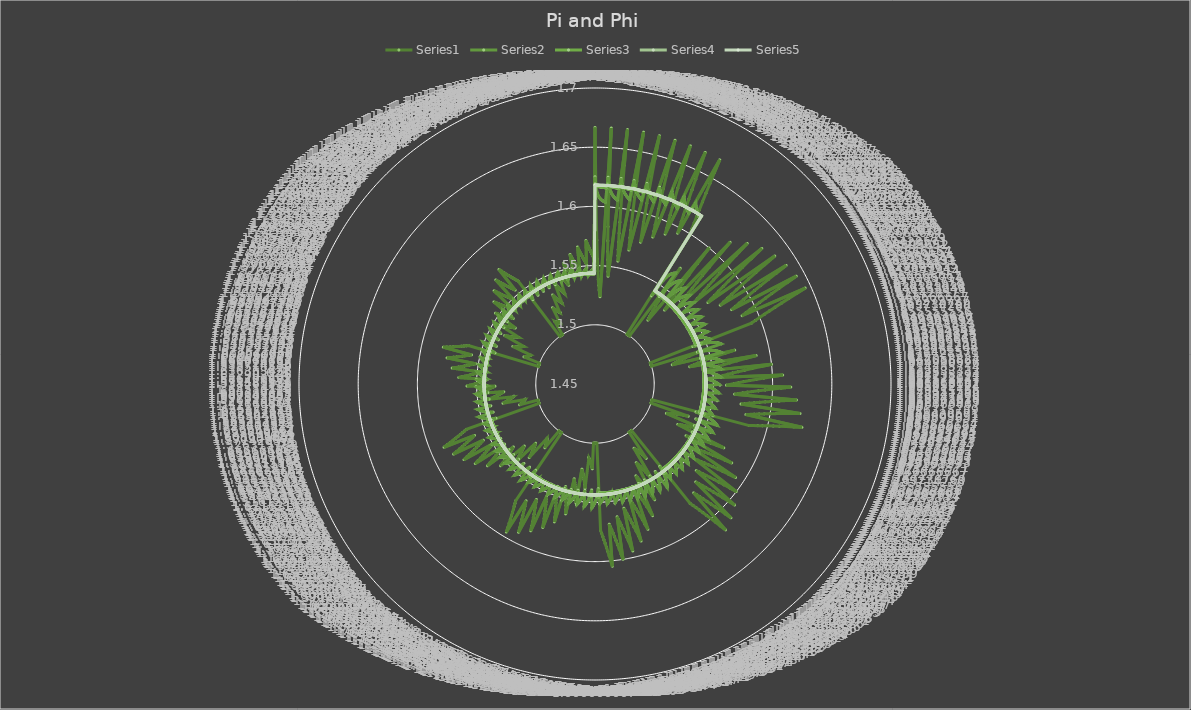
| Category | Series 0 | Series 1 | Series 2 | Series 3 | Series 4 |
|---|---|---|---|---|---|
| 1.5 | 1.667 | 1.625 | 1.619 | 1.618 | 1.618 |
| 1.6666666666666667 | 1.6 | 1.615 | 1.618 | 1.618 | 1.618 |
| 1.75 | 1.571 | 1.611 | 1.617 | 1.618 | 1.618 |
| 1.8 | 1.556 | 1.609 | 1.617 | 1.618 | 1.618 |
| 1.8333333333333333 | 1.545 | 1.607 | 1.616 | 1.618 | 1.618 |
| 1.8571428571428572 | 1.538 | 1.606 | 1.616 | 1.618 | 1.618 |
| 1.875 | 1.533 | 1.605 | 1.616 | 1.618 | 1.618 |
| 1.8888888888888888 | 1.529 | 1.605 | 1.616 | 1.618 | 1.618 |
| 1.9 | 1.526 | 1.604 | 1.616 | 1.618 | 1.618 |
| 1.9090909090909092 | 1.524 | 1.604 | 1.616 | 1.618 | 1.618 |
| 1.5 | 1.667 | 1.625 | 1.619 | 1.618 | 1.618 |
| 1.6 | 1.625 | 1.619 | 1.618 | 1.618 | 1.618 |
| 1.6666666666666667 | 1.6 | 1.615 | 1.618 | 1.618 | 1.618 |
| 1.7142857142857142 | 1.583 | 1.613 | 1.617 | 1.618 | 1.618 |
| 1.75 | 1.571 | 1.611 | 1.617 | 1.618 | 1.618 |
| 1.7777777777777777 | 1.562 | 1.61 | 1.617 | 1.618 | 1.618 |
| 1.8 | 1.556 | 1.609 | 1.617 | 1.618 | 1.618 |
| 1.8181818181818181 | 1.55 | 1.608 | 1.617 | 1.618 | 1.618 |
| 1.8333333333333333 | 1.545 | 1.607 | 1.616 | 1.618 | 1.618 |
| 1.8461538461538463 | 1.542 | 1.607 | 1.616 | 1.618 | 1.618 |
| 1.5 | 1.667 | 1.625 | 1.619 | 1.618 | 1.618 |
| 1.5714285714285714 | 1.636 | 1.621 | 1.618 | 1.618 | 1.618 |
| 1.625 | 1.615 | 1.618 | 1.618 | 1.618 | 1.618 |
| 1.6666666666666667 | 1.6 | 1.615 | 1.618 | 1.618 | 1.618 |
| 1.7 | 1.588 | 1.614 | 1.617 | 1.618 | 1.618 |
| 1.7272727272727273 | 1.579 | 1.612 | 1.617 | 1.618 | 1.618 |
| 1.75 | 1.571 | 1.611 | 1.617 | 1.618 | 1.618 |
| 1.7692307692307692 | 1.565 | 1.61 | 1.617 | 1.618 | 1.618 |
| 1.7857142857142858 | 1.56 | 1.609 | 1.617 | 1.618 | 1.618 |
| 1.8 | 1.556 | 1.609 | 1.617 | 1.618 | 1.618 |
| 1.5 | 1.667 | 1.625 | 1.619 | 1.618 | 1.618 |
| 1.5555555555555556 | 1.643 | 1.622 | 1.619 | 1.618 | 1.618 |
| 1.6 | 1.625 | 1.619 | 1.618 | 1.618 | 1.618 |
| 1.6363636363636365 | 1.611 | 1.617 | 1.618 | 1.618 | 1.618 |
| 1.6666666666666667 | 1.6 | 1.615 | 1.618 | 1.618 | 1.618 |
| 1.6923076923076923 | 1.591 | 1.614 | 1.617 | 1.618 | 1.618 |
| 1.7142857142857142 | 1.583 | 1.613 | 1.617 | 1.618 | 1.618 |
| 1.7333333333333334 | 1.577 | 1.612 | 1.617 | 1.618 | 1.618 |
| 1.75 | 1.571 | 1.611 | 1.617 | 1.618 | 1.618 |
| 1.7647058823529411 | 1.567 | 1.61 | 1.617 | 1.618 | 1.618 |
| 1.5 | 1.667 | 1.625 | 1.619 | 1.618 | 1.618 |
| 1.5454545454545454 | 1.647 | 1.622 | 1.619 | 1.618 | 1.618 |
| 1.5833333333333333 | 1.632 | 1.62 | 1.618 | 1.618 | 1.618 |
| 1.6153846153846154 | 1.619 | 1.618 | 1.618 | 1.618 | 1.618 |
| 1.6428571428571428 | 1.609 | 1.617 | 1.618 | 1.618 | 1.618 |
| 1.6666666666666667 | 1.6 | 1.615 | 1.618 | 1.618 | 1.618 |
| 1.6875 | 1.593 | 1.614 | 1.617 | 1.618 | 1.618 |
| 1.7058823529411764 | 1.586 | 1.613 | 1.617 | 1.618 | 1.618 |
| 1.7222222222222223 | 1.581 | 1.612 | 1.617 | 1.618 | 1.618 |
| 1.736842105263158 | 1.576 | 1.612 | 1.617 | 1.618 | 1.618 |
| 1.5 | 1.667 | 1.625 | 1.619 | 1.618 | 1.618 |
| 1.5384615384615385 | 1.65 | 1.623 | 1.619 | 1.618 | 1.618 |
| 1.5714285714285714 | 1.636 | 1.621 | 1.618 | 1.618 | 1.618 |
| 1.6 | 1.625 | 1.619 | 1.618 | 1.618 | 1.618 |
| 1.625 | 1.615 | 1.618 | 1.618 | 1.618 | 1.618 |
| 1.6470588235294117 | 1.607 | 1.616 | 1.618 | 1.618 | 1.618 |
| 1.6666666666666667 | 1.6 | 1.615 | 1.618 | 1.618 | 1.618 |
| 1.6842105263157894 | 1.594 | 1.614 | 1.618 | 1.618 | 1.618 |
| 1.7 | 1.588 | 1.614 | 1.617 | 1.618 | 1.618 |
| 1.7142857142857142 | 1.583 | 1.613 | 1.617 | 1.618 | 1.618 |
| 1.5 | 1.667 | 1.625 | 1.619 | 1.618 | 1.618 |
| 1.5333333333333334 | 1.652 | 1.623 | 1.619 | 1.618 | 1.618 |
| 1.5625 | 1.64 | 1.621 | 1.618 | 1.618 | 1.618 |
| 1.588235294117647 | 1.63 | 1.62 | 1.618 | 1.618 | 1.618 |
| 1.6111111111111112 | 1.621 | 1.618 | 1.618 | 1.618 | 1.618 |
| 1.631578947368421 | 1.613 | 1.617 | 1.618 | 1.618 | 1.618 |
| 1.65 | 1.606 | 1.616 | 1.618 | 1.618 | 1.618 |
| 1.6666666666666667 | 1.6 | 1.615 | 1.618 | 1.618 | 1.618 |
| 1.6818181818181819 | 1.595 | 1.615 | 1.618 | 1.618 | 1.618 |
| 1.6956521739130435 | 1.59 | 1.614 | 1.617 | 1.618 | 1.618 |
| 1.5 | 1.667 | 1.625 | 1.619 | 1.618 | 1.618 |
| 1.5294117647058822 | 1.654 | 1.623 | 1.619 | 1.618 | 1.618 |
| 1.5555555555555556 | 1.643 | 1.622 | 1.619 | 1.618 | 1.618 |
| 1.5789473684210527 | 1.633 | 1.62 | 1.618 | 1.618 | 1.618 |
| 1.6 | 1.625 | 1.619 | 1.618 | 1.618 | 1.618 |
| 1.619047619047619 | 1.618 | 1.618 | 1.618 | 1.618 | 1.618 |
| 1.6363636363636365 | 1.611 | 1.617 | 1.618 | 1.618 | 1.618 |
| 1.6521739130434783 | 1.605 | 1.616 | 1.618 | 1.618 | 1.618 |
| 1.6666666666666667 | 1.6 | 1.615 | 1.618 | 1.618 | 1.618 |
| 1.68 | 1.595 | 1.615 | 1.618 | 1.618 | 1.618 |
| 1.5 | 1.667 | 1.625 | 1.619 | 1.618 | 1.618 |
| 1.5263157894736843 | 1.655 | 1.623 | 1.619 | 1.618 | 1.618 |
| 1.55 | 1.645 | 1.622 | 1.619 | 1.618 | 1.618 |
| 1.5714285714285714 | 1.636 | 1.621 | 1.618 | 1.618 | 1.618 |
| 1.5909090909090908 | 1.629 | 1.62 | 1.618 | 1.618 | 1.618 |
| 1.608695652173913 | 1.622 | 1.619 | 1.618 | 1.618 | 1.618 |
| 1.625 | 1.615 | 1.618 | 1.618 | 1.618 | 1.618 |
| 1.64 | 1.61 | 1.617 | 1.618 | 1.618 | 1.618 |
| 1.6538461538461537 | 1.605 | 1.616 | 1.618 | 1.618 | 1.618 |
| 1.6666666666666667 | 1.6 | 1.615 | 1.618 | 1.618 | 1.618 |
| 1.5 | 1.5 | 1.538 | 1.545 | 1.544 | 1.544 |
| 1.6666666666666667 | 1.5 | 1.55 | 1.544 | 1.543 | 1.544 |
| 1.75 | 1.5 | 1.556 | 1.543 | 1.543 | 1.544 |
| 1.8 | 1.5 | 1.559 | 1.543 | 1.543 | 1.544 |
| 1.8333333333333333 | 1.5 | 1.561 | 1.543 | 1.543 | 1.544 |
| 1.8571428571428572 | 1.5 | 1.562 | 1.543 | 1.543 | 1.544 |
| 1.875 | 1.5 | 1.564 | 1.543 | 1.543 | 1.544 |
| 1.8888888888888888 | 1.5 | 1.565 | 1.542 | 1.543 | 1.544 |
| 1.9 | 1.5 | 1.565 | 1.542 | 1.543 | 1.544 |
| 1.9090909090909092 | 1.5 | 1.566 | 1.542 | 1.543 | 1.544 |
| 1.5 | 1.571 | 1.542 | 1.543 | 1.544 | 1.544 |
| 1.6 | 1.556 | 1.548 | 1.543 | 1.544 | 1.544 |
| 1.6666666666666667 | 1.545 | 1.553 | 1.543 | 1.544 | 1.544 |
| 1.7142857142857142 | 1.538 | 1.556 | 1.542 | 1.544 | 1.544 |
| 1.75 | 1.533 | 1.558 | 1.542 | 1.543 | 1.544 |
| 1.7777777777777777 | 1.529 | 1.559 | 1.542 | 1.543 | 1.544 |
| 1.8 | 1.526 | 1.561 | 1.542 | 1.543 | 1.544 |
| 1.8181818181818181 | 1.524 | 1.562 | 1.542 | 1.543 | 1.544 |
| 1.8333333333333333 | 1.522 | 1.562 | 1.542 | 1.543 | 1.544 |
| 1.8461538461538463 | 1.52 | 1.563 | 1.542 | 1.543 | 1.544 |
| 1.5 | 1.6 | 1.543 | 1.542 | 1.544 | 1.544 |
| 1.5714285714285714 | 1.583 | 1.548 | 1.542 | 1.544 | 1.544 |
| 1.625 | 1.571 | 1.551 | 1.542 | 1.544 | 1.544 |
| 1.6666666666666667 | 1.562 | 1.554 | 1.542 | 1.544 | 1.544 |
| 1.7 | 1.556 | 1.556 | 1.542 | 1.544 | 1.544 |
| 1.7272727272727273 | 1.55 | 1.557 | 1.542 | 1.544 | 1.544 |
| 1.75 | 1.545 | 1.558 | 1.542 | 1.544 | 1.544 |
| 1.7692307692307692 | 1.542 | 1.56 | 1.542 | 1.543 | 1.544 |
| 1.7857142857142858 | 1.538 | 1.56 | 1.542 | 1.543 | 1.544 |
| 1.8 | 1.536 | 1.561 | 1.542 | 1.543 | 1.544 |
| 1.5 | 1.615 | 1.543 | 1.542 | 1.544 | 1.544 |
| 1.5555555555555556 | 1.6 | 1.547 | 1.542 | 1.544 | 1.544 |
| 1.6 | 1.588 | 1.55 | 1.542 | 1.544 | 1.544 |
| 1.6363636363636365 | 1.579 | 1.552 | 1.542 | 1.544 | 1.544 |
| 1.6666666666666667 | 1.571 | 1.554 | 1.542 | 1.544 | 1.544 |
| 1.6923076923076923 | 1.565 | 1.556 | 1.542 | 1.544 | 1.544 |
| 1.7142857142857142 | 1.56 | 1.557 | 1.542 | 1.544 | 1.544 |
| 1.7333333333333334 | 1.556 | 1.558 | 1.542 | 1.544 | 1.544 |
| 1.75 | 1.552 | 1.559 | 1.542 | 1.544 | 1.544 |
| 1.7647058823529411 | 1.548 | 1.56 | 1.542 | 1.543 | 1.544 |
| 1.5 | 1.625 | 1.544 | 1.542 | 1.544 | 1.544 |
| 1.5454545454545454 | 1.611 | 1.547 | 1.542 | 1.544 | 1.544 |
| 1.5833333333333333 | 1.6 | 1.549 | 1.542 | 1.544 | 1.544 |
| 1.6153846153846154 | 1.591 | 1.551 | 1.542 | 1.544 | 1.544 |
| 1.6428571428571428 | 1.583 | 1.553 | 1.542 | 1.544 | 1.544 |
| 1.6666666666666667 | 1.577 | 1.554 | 1.542 | 1.544 | 1.544 |
| 1.6875 | 1.571 | 1.556 | 1.542 | 1.544 | 1.544 |
| 1.7058823529411764 | 1.567 | 1.557 | 1.542 | 1.544 | 1.544 |
| 1.7222222222222223 | 1.562 | 1.558 | 1.542 | 1.544 | 1.544 |
| 1.736842105263158 | 1.559 | 1.558 | 1.542 | 1.544 | 1.544 |
| 1.5 | 1.632 | 1.544 | 1.541 | 1.544 | 1.544 |
| 1.5384615384615385 | 1.619 | 1.547 | 1.542 | 1.544 | 1.544 |
| 1.5714285714285714 | 1.609 | 1.549 | 1.542 | 1.544 | 1.544 |
| 1.6 | 1.6 | 1.551 | 1.542 | 1.544 | 1.544 |
| 1.625 | 1.593 | 1.552 | 1.542 | 1.544 | 1.544 |
| 1.6470588235294117 | 1.586 | 1.553 | 1.542 | 1.544 | 1.544 |
| 1.6666666666666667 | 1.581 | 1.555 | 1.542 | 1.544 | 1.544 |
| 1.6842105263157894 | 1.576 | 1.556 | 1.542 | 1.544 | 1.544 |
| 1.7 | 1.571 | 1.556 | 1.542 | 1.544 | 1.544 |
| 1.7142857142857142 | 1.568 | 1.557 | 1.542 | 1.544 | 1.544 |
| 1.5 | 1.636 | 1.544 | 1.541 | 1.544 | 1.544 |
| 1.5333333333333334 | 1.625 | 1.547 | 1.541 | 1.544 | 1.544 |
| 1.5625 | 1.615 | 1.548 | 1.541 | 1.544 | 1.544 |
| 1.588235294117647 | 1.607 | 1.55 | 1.541 | 1.544 | 1.544 |
| 1.6111111111111112 | 1.6 | 1.551 | 1.541 | 1.544 | 1.544 |
| 1.631578947368421 | 1.594 | 1.553 | 1.541 | 1.544 | 1.544 |
| 1.65 | 1.588 | 1.554 | 1.541 | 1.544 | 1.544 |
| 1.6666666666666667 | 1.583 | 1.555 | 1.541 | 1.544 | 1.544 |
| 1.6818181818181819 | 1.579 | 1.556 | 1.541 | 1.544 | 1.544 |
| 1.6956521739130435 | 1.575 | 1.556 | 1.541 | 1.544 | 1.544 |
| 1.5 | 1.64 | 1.544 | 1.541 | 1.544 | 1.544 |
| 1.5294117647058822 | 1.63 | 1.546 | 1.541 | 1.544 | 1.544 |
| 1.5555555555555556 | 1.621 | 1.548 | 1.541 | 1.544 | 1.544 |
| 1.5789473684210527 | 1.613 | 1.55 | 1.541 | 1.544 | 1.544 |
| 1.6 | 1.606 | 1.551 | 1.541 | 1.544 | 1.544 |
| 1.619047619047619 | 1.6 | 1.552 | 1.541 | 1.544 | 1.544 |
| 1.6363636363636365 | 1.595 | 1.553 | 1.541 | 1.544 | 1.544 |
| 1.6521739130434783 | 1.59 | 1.554 | 1.541 | 1.544 | 1.544 |
| 1.6666666666666667 | 1.585 | 1.555 | 1.541 | 1.544 | 1.544 |
| 1.68 | 1.581 | 1.556 | 1.541 | 1.544 | 1.544 |
| 1.5 | 1.643 | 1.545 | 1.541 | 1.544 | 1.544 |
| 1.5263157894736843 | 1.633 | 1.546 | 1.541 | 1.544 | 1.544 |
| 1.55 | 1.625 | 1.548 | 1.541 | 1.544 | 1.544 |
| 1.5714285714285714 | 1.618 | 1.549 | 1.541 | 1.544 | 1.544 |
| 1.5909090909090908 | 1.611 | 1.55 | 1.541 | 1.544 | 1.544 |
| 1.608695652173913 | 1.605 | 1.551 | 1.541 | 1.544 | 1.544 |
| 1.625 | 1.6 | 1.552 | 1.541 | 1.544 | 1.544 |
| 1.64 | 1.595 | 1.553 | 1.541 | 1.544 | 1.544 |
| 1.6538461538461537 | 1.591 | 1.554 | 1.541 | 1.544 | 1.544 |
| 1.6666666666666667 | 1.587 | 1.555 | 1.541 | 1.544 | 1.544 |
| 1.5 | 1.645 | 1.545 | 1.541 | 1.544 | 1.544 |
| 1.5238095238095237 | 1.636 | 1.546 | 1.541 | 1.544 | 1.544 |
| 1.5454545454545454 | 1.629 | 1.548 | 1.541 | 1.544 | 1.544 |
| 1.565217391304348 | 1.622 | 1.549 | 1.541 | 1.544 | 1.544 |
| 1.5833333333333333 | 1.615 | 1.55 | 1.541 | 1.544 | 1.544 |
| 1.6 | 1.61 | 1.551 | 1.541 | 1.544 | 1.544 |
| 1.6153846153846154 | 1.605 | 1.552 | 1.541 | 1.544 | 1.544 |
| 1.6296296296296295 | 1.6 | 1.553 | 1.541 | 1.544 | 1.544 |
| 1.6428571428571428 | 1.596 | 1.554 | 1.541 | 1.544 | 1.544 |
| 1.6551724137931034 | 1.592 | 1.554 | 1.541 | 1.544 | 1.544 |
| 1.5 | 1.5 | 1.538 | 1.545 | 1.544 | 1.544 |
| 1.6 | 1.5 | 1.545 | 1.545 | 1.544 | 1.544 |
| 1.6666666666666667 | 1.5 | 1.55 | 1.544 | 1.543 | 1.544 |
| 1.7142857142857142 | 1.5 | 1.553 | 1.544 | 1.543 | 1.544 |
| 1.75 | 1.5 | 1.556 | 1.543 | 1.543 | 1.544 |
| 1.7777777777777777 | 1.5 | 1.557 | 1.543 | 1.543 | 1.544 |
| 1.8 | 1.5 | 1.559 | 1.543 | 1.543 | 1.544 |
| 1.8181818181818181 | 1.5 | 1.56 | 1.543 | 1.543 | 1.544 |
| 1.8333333333333333 | 1.5 | 1.561 | 1.543 | 1.543 | 1.544 |
| 1.8461538461538463 | 1.5 | 1.562 | 1.543 | 1.543 | 1.544 |
| 1.5 | 1.545 | 1.541 | 1.544 | 1.544 | 1.544 |
| 1.5714285714285714 | 1.538 | 1.545 | 1.544 | 1.544 | 1.544 |
| 1.625 | 1.533 | 1.549 | 1.543 | 1.544 | 1.544 |
| 1.6666666666666667 | 1.529 | 1.552 | 1.543 | 1.544 | 1.544 |
| 1.7 | 1.526 | 1.554 | 1.543 | 1.544 | 1.544 |
| 1.7272727272727273 | 1.524 | 1.556 | 1.543 | 1.543 | 1.544 |
| 1.75 | 1.522 | 1.557 | 1.543 | 1.543 | 1.544 |
| 1.7692307692307692 | 1.52 | 1.558 | 1.543 | 1.543 | 1.544 |
| 1.7857142857142858 | 1.519 | 1.559 | 1.543 | 1.543 | 1.544 |
| 1.8 | 1.517 | 1.56 | 1.543 | 1.543 | 1.544 |
| 1.5 | 1.571 | 1.542 | 1.543 | 1.544 | 1.544 |
| 1.5555555555555556 | 1.562 | 1.545 | 1.543 | 1.544 | 1.544 |
| 1.6 | 1.556 | 1.548 | 1.543 | 1.544 | 1.544 |
| 1.6363636363636365 | 1.55 | 1.551 | 1.543 | 1.544 | 1.544 |
| 1.6666666666666667 | 1.545 | 1.553 | 1.543 | 1.544 | 1.544 |
| 1.6923076923076923 | 1.542 | 1.554 | 1.543 | 1.544 | 1.544 |
| 1.7142857142857142 | 1.538 | 1.556 | 1.542 | 1.544 | 1.544 |
| 1.7333333333333334 | 1.536 | 1.557 | 1.542 | 1.543 | 1.544 |
| 1.75 | 1.533 | 1.558 | 1.542 | 1.543 | 1.544 |
| 1.7647058823529411 | 1.531 | 1.559 | 1.542 | 1.543 | 1.544 |
| 1.5 | 1.588 | 1.542 | 1.543 | 1.544 | 1.544 |
| 1.5454545454545454 | 1.579 | 1.545 | 1.543 | 1.544 | 1.544 |
| 1.5833333333333333 | 1.571 | 1.548 | 1.543 | 1.544 | 1.544 |
| 1.6153846153846154 | 1.565 | 1.55 | 1.542 | 1.544 | 1.544 |
| 1.6428571428571428 | 1.56 | 1.552 | 1.542 | 1.544 | 1.544 |
| 1.6666666666666667 | 1.556 | 1.553 | 1.542 | 1.544 | 1.544 |
| 1.6875 | 1.552 | 1.554 | 1.542 | 1.544 | 1.544 |
| 1.7058823529411764 | 1.548 | 1.556 | 1.542 | 1.544 | 1.544 |
| 1.7222222222222223 | 1.545 | 1.557 | 1.542 | 1.544 | 1.544 |
| 1.736842105263158 | 1.543 | 1.557 | 1.542 | 1.544 | 1.544 |
| 1.5 | 1.6 | 1.543 | 1.542 | 1.544 | 1.544 |
| 1.5384615384615385 | 1.591 | 1.545 | 1.542 | 1.544 | 1.544 |
| 1.5714285714285714 | 1.583 | 1.548 | 1.542 | 1.544 | 1.544 |
| 1.6 | 1.577 | 1.549 | 1.542 | 1.544 | 1.544 |
| 1.625 | 1.571 | 1.551 | 1.542 | 1.544 | 1.544 |
| 1.6470588235294117 | 1.567 | 1.552 | 1.542 | 1.544 | 1.544 |
| 1.6666666666666667 | 1.562 | 1.554 | 1.542 | 1.544 | 1.544 |
| 1.6842105263157894 | 1.559 | 1.555 | 1.542 | 1.544 | 1.544 |
| 1.7 | 1.556 | 1.556 | 1.542 | 1.544 | 1.544 |
| 1.7142857142857142 | 1.553 | 1.556 | 1.542 | 1.544 | 1.544 |
| 1.5 | 1.609 | 1.543 | 1.542 | 1.544 | 1.544 |
| 1.5333333333333334 | 1.6 | 1.545 | 1.542 | 1.544 | 1.544 |
| 1.5625 | 1.593 | 1.547 | 1.542 | 1.544 | 1.544 |
| 1.588235294117647 | 1.586 | 1.549 | 1.542 | 1.544 | 1.544 |
| 1.6111111111111112 | 1.581 | 1.55 | 1.542 | 1.544 | 1.544 |
| 1.631578947368421 | 1.576 | 1.552 | 1.542 | 1.544 | 1.544 |
| 1.65 | 1.571 | 1.553 | 1.542 | 1.544 | 1.544 |
| 1.6666666666666667 | 1.568 | 1.554 | 1.542 | 1.544 | 1.544 |
| 1.6818181818181819 | 1.564 | 1.555 | 1.542 | 1.544 | 1.544 |
| 1.6956521739130435 | 1.561 | 1.556 | 1.542 | 1.544 | 1.544 |
| 1.5 | 1.615 | 1.543 | 1.542 | 1.544 | 1.544 |
| 1.5294117647058822 | 1.607 | 1.545 | 1.542 | 1.544 | 1.544 |
| 1.5555555555555556 | 1.6 | 1.547 | 1.542 | 1.544 | 1.544 |
| 1.5789473684210527 | 1.594 | 1.549 | 1.542 | 1.544 | 1.544 |
| 1.6 | 1.588 | 1.55 | 1.542 | 1.544 | 1.544 |
| 1.619047619047619 | 1.583 | 1.551 | 1.542 | 1.544 | 1.544 |
| 1.6363636363636365 | 1.579 | 1.552 | 1.542 | 1.544 | 1.544 |
| 1.6521739130434783 | 1.575 | 1.553 | 1.542 | 1.544 | 1.544 |
| 1.6666666666666667 | 1.571 | 1.554 | 1.542 | 1.544 | 1.544 |
| 1.68 | 1.568 | 1.555 | 1.542 | 1.544 | 1.544 |
| 1.5 | 1.621 | 1.544 | 1.542 | 1.544 | 1.544 |
| 1.5263157894736843 | 1.613 | 1.545 | 1.542 | 1.544 | 1.544 |
| 1.55 | 1.606 | 1.547 | 1.542 | 1.544 | 1.544 |
| 1.5714285714285714 | 1.6 | 1.548 | 1.542 | 1.544 | 1.544 |
| 1.5909090909090908 | 1.595 | 1.55 | 1.542 | 1.544 | 1.544 |
| 1.608695652173913 | 1.59 | 1.551 | 1.542 | 1.544 | 1.544 |
| 1.625 | 1.585 | 1.552 | 1.542 | 1.544 | 1.544 |
| 1.64 | 1.581 | 1.553 | 1.542 | 1.544 | 1.544 |
| 1.6538461538461537 | 1.578 | 1.553 | 1.542 | 1.544 | 1.544 |
| 1.6666666666666667 | 1.574 | 1.554 | 1.542 | 1.544 | 1.544 |
| 1.5 | 1.625 | 1.544 | 1.542 | 1.544 | 1.544 |
| 1.5238095238095237 | 1.618 | 1.545 | 1.542 | 1.544 | 1.544 |
| 1.5454545454545454 | 1.611 | 1.547 | 1.542 | 1.544 | 1.544 |
| 1.565217391304348 | 1.605 | 1.548 | 1.542 | 1.544 | 1.544 |
| 1.5833333333333333 | 1.6 | 1.549 | 1.542 | 1.544 | 1.544 |
| 1.6 | 1.595 | 1.55 | 1.542 | 1.544 | 1.544 |
| 1.6153846153846154 | 1.591 | 1.551 | 1.542 | 1.544 | 1.544 |
| 1.6296296296296295 | 1.587 | 1.552 | 1.542 | 1.544 | 1.544 |
| 1.6428571428571428 | 1.583 | 1.553 | 1.542 | 1.544 | 1.544 |
| 1.6551724137931034 | 1.58 | 1.554 | 1.542 | 1.544 | 1.544 |
| 1.5 | 1.629 | 1.544 | 1.542 | 1.544 | 1.544 |
| 1.5217391304347827 | 1.622 | 1.545 | 1.542 | 1.544 | 1.544 |
| 1.5416666666666667 | 1.615 | 1.547 | 1.542 | 1.544 | 1.544 |
| 1.56 | 1.61 | 1.548 | 1.542 | 1.544 | 1.544 |
| 1.5769230769230769 | 1.605 | 1.549 | 1.542 | 1.544 | 1.544 |
| 1.5925925925925926 | 1.6 | 1.55 | 1.542 | 1.544 | 1.544 |
| 1.6071428571428572 | 1.596 | 1.551 | 1.542 | 1.544 | 1.544 |
| 1.6206896551724137 | 1.592 | 1.552 | 1.542 | 1.544 | 1.544 |
| 1.6333333333333333 | 1.588 | 1.552 | 1.542 | 1.544 | 1.544 |
| 1.6451612903225807 | 1.585 | 1.553 | 1.542 | 1.544 | 1.544 |
| 1.5 | 1.5 | 1.538 | 1.545 | 1.544 | 1.544 |
| 1.5714285714285714 | 1.5 | 1.543 | 1.545 | 1.544 | 1.544 |
| 1.625 | 1.5 | 1.547 | 1.544 | 1.544 | 1.544 |
| 1.6666666666666667 | 1.5 | 1.55 | 1.544 | 1.543 | 1.544 |
| 1.7 | 1.5 | 1.552 | 1.544 | 1.543 | 1.544 |
| 1.7272727272727273 | 1.5 | 1.554 | 1.544 | 1.543 | 1.544 |
| 1.75 | 1.5 | 1.556 | 1.543 | 1.543 | 1.544 |
| 1.7692307692307692 | 1.5 | 1.557 | 1.543 | 1.543 | 1.544 |
| 1.7857142857142858 | 1.5 | 1.558 | 1.543 | 1.543 | 1.544 |
| 1.8 | 1.5 | 1.559 | 1.543 | 1.543 | 1.544 |
| 1.5 | 1.533 | 1.54 | 1.544 | 1.544 | 1.544 |
| 1.5555555555555556 | 1.529 | 1.544 | 1.544 | 1.544 | 1.544 |
| 1.6 | 1.526 | 1.547 | 1.544 | 1.544 | 1.544 |
| 1.6363636363636365 | 1.524 | 1.549 | 1.544 | 1.544 | 1.544 |
| 1.6666666666666667 | 1.522 | 1.551 | 1.543 | 1.544 | 1.544 |
| 1.6923076923076923 | 1.52 | 1.553 | 1.543 | 1.544 | 1.544 |
| 1.7142857142857142 | 1.519 | 1.554 | 1.543 | 1.543 | 1.544 |
| 1.7333333333333334 | 1.517 | 1.556 | 1.543 | 1.543 | 1.544 |
| 1.75 | 1.516 | 1.557 | 1.543 | 1.543 | 1.544 |
| 1.7647058823529411 | 1.515 | 1.558 | 1.543 | 1.543 | 1.544 |
| 1.5 | 1.556 | 1.541 | 1.544 | 1.544 | 1.544 |
| 1.5454545454545454 | 1.55 | 1.544 | 1.543 | 1.544 | 1.544 |
| 1.5833333333333333 | 1.545 | 1.547 | 1.543 | 1.544 | 1.544 |
| 1.6153846153846154 | 1.542 | 1.549 | 1.543 | 1.544 | 1.544 |
| 1.6428571428571428 | 1.538 | 1.551 | 1.543 | 1.544 | 1.544 |
| 1.6666666666666667 | 1.536 | 1.552 | 1.543 | 1.544 | 1.544 |
| 1.6875 | 1.533 | 1.553 | 1.543 | 1.544 | 1.544 |
| 1.7058823529411764 | 1.531 | 1.555 | 1.543 | 1.544 | 1.544 |
| 1.7222222222222223 | 1.529 | 1.556 | 1.543 | 1.543 | 1.544 |
| 1.736842105263158 | 1.528 | 1.556 | 1.543 | 1.543 | 1.544 |
| 1.5 | 1.571 | 1.542 | 1.543 | 1.544 | 1.544 |
| 1.5384615384615385 | 1.565 | 1.544 | 1.543 | 1.544 | 1.544 |
| 1.5714285714285714 | 1.56 | 1.547 | 1.543 | 1.544 | 1.544 |
| 1.6 | 1.556 | 1.548 | 1.543 | 1.544 | 1.544 |
| 1.625 | 1.552 | 1.55 | 1.543 | 1.544 | 1.544 |
| 1.6470588235294117 | 1.548 | 1.551 | 1.543 | 1.544 | 1.544 |
| 1.6666666666666667 | 1.545 | 1.553 | 1.543 | 1.544 | 1.544 |
| 1.6842105263157894 | 1.543 | 1.554 | 1.543 | 1.544 | 1.544 |
| 1.7 | 1.541 | 1.555 | 1.543 | 1.544 | 1.544 |
| 1.7142857142857142 | 1.538 | 1.556 | 1.542 | 1.544 | 1.544 |
| 1.5 | 1.583 | 1.542 | 1.543 | 1.544 | 1.544 |
| 1.5333333333333334 | 1.577 | 1.544 | 1.543 | 1.544 | 1.544 |
| 1.5625 | 1.571 | 1.546 | 1.543 | 1.544 | 1.544 |
| 1.588235294117647 | 1.567 | 1.548 | 1.543 | 1.544 | 1.544 |
| 1.6111111111111112 | 1.562 | 1.55 | 1.543 | 1.544 | 1.544 |
| 1.631578947368421 | 1.559 | 1.551 | 1.542 | 1.544 | 1.544 |
| 1.65 | 1.556 | 1.552 | 1.542 | 1.544 | 1.544 |
| 1.6666666666666667 | 1.553 | 1.553 | 1.542 | 1.544 | 1.544 |
| 1.6818181818181819 | 1.55 | 1.554 | 1.542 | 1.544 | 1.544 |
| 1.6956521739130435 | 1.548 | 1.555 | 1.542 | 1.544 | 1.544 |
| 1.5 | 1.593 | 1.543 | 1.543 | 1.544 | 1.544 |
| 1.5294117647058822 | 1.586 | 1.545 | 1.543 | 1.544 | 1.544 |
| 1.5555555555555556 | 1.581 | 1.546 | 1.542 | 1.544 | 1.544 |
| 1.5789473684210527 | 1.576 | 1.548 | 1.542 | 1.544 | 1.544 |
| 1.6 | 1.571 | 1.549 | 1.542 | 1.544 | 1.544 |
| 1.619047619047619 | 1.568 | 1.55 | 1.542 | 1.544 | 1.544 |
| 1.6363636363636365 | 1.564 | 1.551 | 1.542 | 1.544 | 1.544 |
| 1.6521739130434783 | 1.561 | 1.552 | 1.542 | 1.544 | 1.544 |
| 1.6666666666666667 | 1.558 | 1.553 | 1.542 | 1.544 | 1.544 |
| 1.68 | 1.556 | 1.554 | 1.542 | 1.544 | 1.544 |
| 1.5 | 1.6 | 1.543 | 1.542 | 1.544 | 1.544 |
| 1.5263157894736843 | 1.594 | 1.545 | 1.542 | 1.544 | 1.544 |
| 1.55 | 1.588 | 1.546 | 1.542 | 1.544 | 1.544 |
| 1.5714285714285714 | 1.583 | 1.548 | 1.542 | 1.544 | 1.544 |
| 1.5909090909090908 | 1.579 | 1.549 | 1.542 | 1.544 | 1.544 |
| 1.608695652173913 | 1.575 | 1.55 | 1.542 | 1.544 | 1.544 |
| 1.625 | 1.571 | 1.551 | 1.542 | 1.544 | 1.544 |
| 1.64 | 1.568 | 1.552 | 1.542 | 1.544 | 1.544 |
| 1.6538461538461537 | 1.565 | 1.553 | 1.542 | 1.544 | 1.544 |
| 1.6666666666666667 | 1.562 | 1.554 | 1.542 | 1.544 | 1.544 |
| 1.5 | 1.606 | 1.543 | 1.542 | 1.544 | 1.544 |
| 1.5238095238095237 | 1.6 | 1.545 | 1.542 | 1.544 | 1.544 |
| 1.5454545454545454 | 1.595 | 1.546 | 1.542 | 1.544 | 1.544 |
| 1.565217391304348 | 1.59 | 1.547 | 1.542 | 1.544 | 1.544 |
| 1.5833333333333333 | 1.585 | 1.549 | 1.542 | 1.544 | 1.544 |
| 1.6 | 1.581 | 1.55 | 1.542 | 1.544 | 1.544 |
| 1.6153846153846154 | 1.578 | 1.551 | 1.542 | 1.544 | 1.544 |
| 1.6296296296296295 | 1.574 | 1.552 | 1.542 | 1.544 | 1.544 |
| 1.6428571428571428 | 1.571 | 1.552 | 1.542 | 1.544 | 1.544 |
| 1.6551724137931034 | 1.569 | 1.553 | 1.542 | 1.544 | 1.544 |
| 1.5 | 1.611 | 1.543 | 1.542 | 1.544 | 1.544 |
| 1.5217391304347827 | 1.605 | 1.545 | 1.542 | 1.544 | 1.544 |
| 1.5416666666666667 | 1.6 | 1.546 | 1.542 | 1.544 | 1.544 |
| 1.56 | 1.595 | 1.547 | 1.542 | 1.544 | 1.544 |
| 1.5769230769230769 | 1.591 | 1.548 | 1.542 | 1.544 | 1.544 |
| 1.5925925925925926 | 1.587 | 1.549 | 1.542 | 1.544 | 1.544 |
| 1.6071428571428572 | 1.583 | 1.55 | 1.542 | 1.544 | 1.544 |
| 1.6206896551724137 | 1.58 | 1.551 | 1.542 | 1.544 | 1.544 |
| 1.6333333333333333 | 1.577 | 1.552 | 1.542 | 1.544 | 1.544 |
| 1.6451612903225807 | 1.574 | 1.553 | 1.542 | 1.544 | 1.544 |
| 1.5 | 1.615 | 1.543 | 1.542 | 1.544 | 1.544 |
| 1.52 | 1.61 | 1.545 | 1.542 | 1.544 | 1.544 |
| 1.5384615384615385 | 1.605 | 1.546 | 1.542 | 1.544 | 1.544 |
| 1.5555555555555556 | 1.6 | 1.547 | 1.542 | 1.544 | 1.544 |
| 1.5714285714285714 | 1.596 | 1.548 | 1.542 | 1.544 | 1.544 |
| 1.5862068965517242 | 1.592 | 1.549 | 1.542 | 1.544 | 1.544 |
| 1.6 | 1.588 | 1.55 | 1.542 | 1.544 | 1.544 |
| 1.6129032258064515 | 1.585 | 1.551 | 1.542 | 1.544 | 1.544 |
| 1.625 | 1.582 | 1.552 | 1.542 | 1.544 | 1.544 |
| 1.6363636363636365 | 1.579 | 1.552 | 1.542 | 1.544 | 1.544 |
| 1.5 | 1.5 | 1.538 | 1.545 | 1.544 | 1.544 |
| 1.5555555555555556 | 1.5 | 1.542 | 1.545 | 1.544 | 1.544 |
| 1.6 | 1.5 | 1.545 | 1.545 | 1.544 | 1.544 |
| 1.6363636363636365 | 1.5 | 1.548 | 1.544 | 1.544 | 1.544 |
| 1.6666666666666667 | 1.5 | 1.55 | 1.544 | 1.543 | 1.544 |
| 1.6923076923076923 | 1.5 | 1.552 | 1.544 | 1.543 | 1.544 |
| 1.7142857142857142 | 1.5 | 1.553 | 1.544 | 1.543 | 1.544 |
| 1.7333333333333334 | 1.5 | 1.554 | 1.544 | 1.543 | 1.544 |
| 1.75 | 1.5 | 1.556 | 1.543 | 1.543 | 1.544 |
| 1.7647058823529411 | 1.5 | 1.557 | 1.543 | 1.543 | 1.544 |
| 1.5 | 1.526 | 1.54 | 1.545 | 1.544 | 1.544 |
| 1.5454545454545454 | 1.524 | 1.543 | 1.544 | 1.544 | 1.544 |
| 1.5833333333333333 | 1.522 | 1.545 | 1.544 | 1.544 | 1.544 |
| 1.6153846153846154 | 1.52 | 1.548 | 1.544 | 1.544 | 1.544 |
| 1.6428571428571428 | 1.519 | 1.549 | 1.544 | 1.544 | 1.544 |
| 1.6666666666666667 | 1.517 | 1.551 | 1.544 | 1.544 | 1.544 |
| 1.6875 | 1.516 | 1.552 | 1.543 | 1.543 | 1.544 |
| 1.7058823529411764 | 1.515 | 1.554 | 1.543 | 1.543 | 1.544 |
| 1.7222222222222223 | 1.514 | 1.555 | 1.543 | 1.543 | 1.544 |
| 1.736842105263158 | 1.514 | 1.556 | 1.543 | 1.543 | 1.544 |
| 1.5 | 1.545 | 1.541 | 1.544 | 1.544 | 1.544 |
| 1.5384615384615385 | 1.542 | 1.543 | 1.544 | 1.544 | 1.544 |
| 1.5714285714285714 | 1.538 | 1.545 | 1.544 | 1.544 | 1.544 |
| 1.6 | 1.536 | 1.547 | 1.543 | 1.544 | 1.544 |
| 1.625 | 1.533 | 1.549 | 1.543 | 1.544 | 1.544 |
| 1.6470588235294117 | 1.531 | 1.55 | 1.543 | 1.544 | 1.544 |
| 1.6666666666666667 | 1.529 | 1.552 | 1.543 | 1.544 | 1.544 |
| 1.6842105263157894 | 1.528 | 1.553 | 1.543 | 1.544 | 1.544 |
| 1.7 | 1.526 | 1.554 | 1.543 | 1.544 | 1.544 |
| 1.7142857142857142 | 1.525 | 1.555 | 1.543 | 1.543 | 1.544 |
| 1.5 | 1.56 | 1.541 | 1.544 | 1.544 | 1.544 |
| 1.5333333333333334 | 1.556 | 1.543 | 1.543 | 1.544 | 1.544 |
| 1.5625 | 1.552 | 1.545 | 1.543 | 1.544 | 1.544 |
| 1.588235294117647 | 1.548 | 1.547 | 1.543 | 1.544 | 1.544 |
| 1.6111111111111112 | 1.545 | 1.549 | 1.543 | 1.544 | 1.544 |
| 1.631578947368421 | 1.543 | 1.55 | 1.543 | 1.544 | 1.544 |
| 1.65 | 1.541 | 1.551 | 1.543 | 1.544 | 1.544 |
| 1.6666666666666667 | 1.538 | 1.552 | 1.543 | 1.544 | 1.544 |
| 1.6818181818181819 | 1.537 | 1.553 | 1.543 | 1.544 | 1.544 |
| 1.6956521739130435 | 1.535 | 1.554 | 1.543 | 1.544 | 1.544 |
| 1.5 | 1.571 | 1.542 | 1.543 | 1.544 | 1.544 |
| 1.5294117647058822 | 1.567 | 1.544 | 1.543 | 1.544 | 1.544 |
| 1.5555555555555556 | 1.562 | 1.545 | 1.543 | 1.544 | 1.544 |
| 1.5789473684210527 | 1.559 | 1.547 | 1.543 | 1.544 | 1.544 |
| 1.6 | 1.556 | 1.548 | 1.543 | 1.544 | 1.544 |
| 1.619047619047619 | 1.553 | 1.55 | 1.543 | 1.544 | 1.544 |
| 1.6363636363636365 | 1.55 | 1.551 | 1.543 | 1.544 | 1.544 |
| 1.6521739130434783 | 1.548 | 1.552 | 1.543 | 1.544 | 1.544 |
| 1.6666666666666667 | 1.545 | 1.553 | 1.543 | 1.544 | 1.544 |
| 1.68 | 1.543 | 1.553 | 1.543 | 1.544 | 1.544 |
| 1.5 | 1.581 | 1.542 | 1.543 | 1.544 | 1.544 |
| 1.5263157894736843 | 1.576 | 1.544 | 1.543 | 1.544 | 1.544 |
| 1.55 | 1.571 | 1.545 | 1.543 | 1.544 | 1.544 |
| 1.5714285714285714 | 1.568 | 1.547 | 1.543 | 1.544 | 1.544 |
| 1.5909090909090908 | 1.564 | 1.548 | 1.543 | 1.544 | 1.544 |
| 1.608695652173913 | 1.561 | 1.549 | 1.543 | 1.544 | 1.544 |
| 1.625 | 1.558 | 1.55 | 1.543 | 1.544 | 1.544 |
| 1.64 | 1.556 | 1.551 | 1.543 | 1.544 | 1.544 |
| 1.6538461538461537 | 1.553 | 1.552 | 1.542 | 1.544 | 1.544 |
| 1.6666666666666667 | 1.551 | 1.553 | 1.542 | 1.544 | 1.544 |
| 1.5 | 1.588 | 1.542 | 1.543 | 1.544 | 1.544 |
| 1.5238095238095237 | 1.583 | 1.544 | 1.543 | 1.544 | 1.544 |
| 1.5454545454545454 | 1.579 | 1.545 | 1.543 | 1.544 | 1.544 |
| 1.565217391304348 | 1.575 | 1.547 | 1.543 | 1.544 | 1.544 |
| 1.5833333333333333 | 1.571 | 1.548 | 1.543 | 1.544 | 1.544 |
| 1.6 | 1.568 | 1.549 | 1.542 | 1.544 | 1.544 |
| 1.6153846153846154 | 1.565 | 1.55 | 1.542 | 1.544 | 1.544 |
| 1.6296296296296295 | 1.562 | 1.551 | 1.542 | 1.544 | 1.544 |
| 1.6428571428571428 | 1.56 | 1.552 | 1.542 | 1.544 | 1.544 |
| 1.6551724137931034 | 1.558 | 1.552 | 1.542 | 1.544 | 1.544 |
| 1.5 | 1.595 | 1.543 | 1.543 | 1.544 | 1.544 |
| 1.5217391304347827 | 1.59 | 1.544 | 1.542 | 1.544 | 1.544 |
| 1.5416666666666667 | 1.585 | 1.545 | 1.542 | 1.544 | 1.544 |
| 1.56 | 1.581 | 1.547 | 1.542 | 1.544 | 1.544 |
| 1.5769230769230769 | 1.578 | 1.548 | 1.542 | 1.544 | 1.544 |
| 1.5925925925925926 | 1.574 | 1.549 | 1.542 | 1.544 | 1.544 |
| 1.6071428571428572 | 1.571 | 1.55 | 1.542 | 1.544 | 1.544 |
| 1.6206896551724137 | 1.569 | 1.551 | 1.542 | 1.544 | 1.544 |
| 1.6333333333333333 | 1.566 | 1.551 | 1.542 | 1.544 | 1.544 |
| 1.6451612903225807 | 1.564 | 1.552 | 1.542 | 1.544 | 1.544 |
| 1.5 | 1.6 | 1.543 | 1.542 | 1.544 | 1.544 |
| 1.52 | 1.595 | 1.544 | 1.542 | 1.544 | 1.544 |
| 1.5384615384615385 | 1.591 | 1.545 | 1.542 | 1.544 | 1.544 |
| 1.5555555555555556 | 1.587 | 1.547 | 1.542 | 1.544 | 1.544 |
| 1.5714285714285714 | 1.583 | 1.548 | 1.542 | 1.544 | 1.544 |
| 1.5862068965517242 | 1.58 | 1.549 | 1.542 | 1.544 | 1.544 |
| 1.6 | 1.577 | 1.549 | 1.542 | 1.544 | 1.544 |
| 1.6129032258064515 | 1.574 | 1.55 | 1.542 | 1.544 | 1.544 |
| 1.625 | 1.571 | 1.551 | 1.542 | 1.544 | 1.544 |
| 1.6363636363636365 | 1.569 | 1.552 | 1.542 | 1.544 | 1.544 |
| 1.5 | 1.605 | 1.543 | 1.542 | 1.544 | 1.544 |
| 1.5185185185185186 | 1.6 | 1.544 | 1.542 | 1.544 | 1.544 |
| 1.5357142857142858 | 1.596 | 1.545 | 1.542 | 1.544 | 1.544 |
| 1.5517241379310345 | 1.592 | 1.547 | 1.542 | 1.544 | 1.544 |
| 1.5666666666666667 | 1.588 | 1.547 | 1.542 | 1.544 | 1.544 |
| 1.5806451612903225 | 1.585 | 1.548 | 1.542 | 1.544 | 1.544 |
| 1.59375 | 1.582 | 1.549 | 1.542 | 1.544 | 1.544 |
| 1.606060606060606 | 1.579 | 1.55 | 1.542 | 1.544 | 1.544 |
| 1.6176470588235294 | 1.576 | 1.551 | 1.542 | 1.544 | 1.544 |
| 1.6285714285714286 | 1.574 | 1.551 | 1.542 | 1.544 | 1.544 |
| 1.5 | 1.5 | 1.538 | 1.545 | 1.544 | 1.544 |
| 1.5454545454545454 | 1.5 | 1.542 | 1.545 | 1.544 | 1.544 |
| 1.5833333333333333 | 1.5 | 1.544 | 1.545 | 1.544 | 1.544 |
| 1.6153846153846154 | 1.5 | 1.547 | 1.545 | 1.544 | 1.544 |
| 1.6428571428571428 | 1.5 | 1.548 | 1.544 | 1.543 | 1.544 |
| 1.6666666666666667 | 1.5 | 1.55 | 1.544 | 1.543 | 1.544 |
| 1.6875 | 1.5 | 1.551 | 1.544 | 1.543 | 1.544 |
| 1.7058823529411764 | 1.5 | 1.553 | 1.544 | 1.543 | 1.544 |
| 1.7222222222222223 | 1.5 | 1.554 | 1.544 | 1.543 | 1.544 |
| 1.736842105263158 | 1.5 | 1.555 | 1.544 | 1.543 | 1.544 |
| 1.5 | 1.522 | 1.539 | 1.545 | 1.544 | 1.544 |
| 1.5384615384615385 | 1.52 | 1.542 | 1.544 | 1.544 | 1.544 |
| 1.5714285714285714 | 1.519 | 1.544 | 1.544 | 1.544 | 1.544 |
| 1.6 | 1.517 | 1.546 | 1.544 | 1.544 | 1.544 |
| 1.625 | 1.516 | 1.548 | 1.544 | 1.544 | 1.544 |
| 1.6470588235294117 | 1.515 | 1.55 | 1.544 | 1.544 | 1.544 |
| 1.6666666666666667 | 1.514 | 1.551 | 1.544 | 1.544 | 1.544 |
| 1.6842105263157894 | 1.514 | 1.552 | 1.544 | 1.543 | 1.544 |
| 1.7 | 1.513 | 1.553 | 1.543 | 1.543 | 1.544 |
| 1.7142857142857142 | 1.512 | 1.554 | 1.543 | 1.543 | 1.544 |
| 1.5 | 1.538 | 1.54 | 1.544 | 1.544 | 1.544 |
| 1.5333333333333334 | 1.536 | 1.543 | 1.544 | 1.544 | 1.544 |
| 1.5625 | 1.533 | 1.545 | 1.544 | 1.544 | 1.544 |
| 1.588235294117647 | 1.531 | 1.546 | 1.544 | 1.544 | 1.544 |
| 1.6111111111111112 | 1.529 | 1.548 | 1.544 | 1.544 | 1.544 |
| 1.631578947368421 | 1.528 | 1.549 | 1.543 | 1.544 | 1.544 |
| 1.65 | 1.526 | 1.55 | 1.543 | 1.544 | 1.544 |
| 1.6666666666666667 | 1.525 | 1.551 | 1.543 | 1.544 | 1.544 |
| 1.6818181818181819 | 1.524 | 1.552 | 1.543 | 1.544 | 1.544 |
| 1.6956521739130435 | 1.523 | 1.553 | 1.543 | 1.544 | 1.544 |
| 1.5 | 1.552 | 1.541 | 1.544 | 1.544 | 1.544 |
| 1.5294117647058822 | 1.548 | 1.543 | 1.544 | 1.544 | 1.544 |
| 1.5555555555555556 | 1.545 | 1.545 | 1.544 | 1.544 | 1.544 |
| 1.5789473684210527 | 1.543 | 1.546 | 1.543 | 1.544 | 1.544 |
| 1.6 | 1.541 | 1.548 | 1.543 | 1.544 | 1.544 |
| 1.619047619047619 | 1.538 | 1.549 | 1.543 | 1.544 | 1.544 |
| 1.6363636363636365 | 1.537 | 1.55 | 1.543 | 1.544 | 1.544 |
| 1.6521739130434783 | 1.535 | 1.551 | 1.543 | 1.544 | 1.544 |
| 1.6666666666666667 | 1.533 | 1.552 | 1.543 | 1.544 | 1.544 |
| 1.68 | 1.532 | 1.553 | 1.543 | 1.544 | 1.544 |
| 1.5 | 1.562 | 1.541 | 1.543 | 1.544 | 1.544 |
| 1.5263157894736843 | 1.559 | 1.543 | 1.543 | 1.544 | 1.544 |
| 1.55 | 1.556 | 1.545 | 1.543 | 1.544 | 1.544 |
| 1.5714285714285714 | 1.553 | 1.546 | 1.543 | 1.544 | 1.544 |
| 1.5909090909090908 | 1.55 | 1.547 | 1.543 | 1.544 | 1.544 |
| 1.608695652173913 | 1.548 | 1.549 | 1.543 | 1.544 | 1.544 |
| 1.625 | 1.545 | 1.55 | 1.543 | 1.544 | 1.544 |
| 1.64 | 1.543 | 1.551 | 1.543 | 1.544 | 1.544 |
| 1.6538461538461537 | 1.542 | 1.552 | 1.543 | 1.544 | 1.544 |
| 1.6666666666666667 | 1.54 | 1.552 | 1.543 | 1.544 | 1.544 |
| 1.5 | 1.571 | 1.542 | 1.543 | 1.544 | 1.544 |
| 1.5238095238095237 | 1.568 | 1.543 | 1.543 | 1.544 | 1.544 |
| 1.5454545454545454 | 1.564 | 1.545 | 1.543 | 1.544 | 1.544 |
| 1.565217391304348 | 1.561 | 1.546 | 1.543 | 1.544 | 1.544 |
| 1.5833333333333333 | 1.558 | 1.547 | 1.543 | 1.544 | 1.544 |
| 1.6 | 1.556 | 1.548 | 1.543 | 1.544 | 1.544 |
| 1.6153846153846154 | 1.553 | 1.549 | 1.543 | 1.544 | 1.544 |
| 1.6296296296296295 | 1.551 | 1.55 | 1.543 | 1.544 | 1.544 |
| 1.6428571428571428 | 1.549 | 1.551 | 1.543 | 1.544 | 1.544 |
| 1.6551724137931034 | 1.547 | 1.552 | 1.543 | 1.544 | 1.544 |
| 1.5 | 1.579 | 1.542 | 1.543 | 1.544 | 1.544 |
| 1.5217391304347827 | 1.575 | 1.543 | 1.543 | 1.544 | 1.544 |
| 1.5416666666666667 | 1.571 | 1.545 | 1.543 | 1.544 | 1.544 |
| 1.56 | 1.568 | 1.546 | 1.543 | 1.544 | 1.544 |
| 1.5769230769230769 | 1.565 | 1.547 | 1.543 | 1.544 | 1.544 |
| 1.5925925925925926 | 1.562 | 1.548 | 1.543 | 1.544 | 1.544 |
| 1.6071428571428572 | 1.56 | 1.549 | 1.543 | 1.544 | 1.544 |
| 1.6206896551724137 | 1.558 | 1.55 | 1.543 | 1.544 | 1.544 |
| 1.6333333333333333 | 1.556 | 1.551 | 1.543 | 1.544 | 1.544 |
| 1.6451612903225807 | 1.554 | 1.552 | 1.543 | 1.544 | 1.544 |
| 1.5 | 1.585 | 1.542 | 1.543 | 1.544 | 1.544 |
| 1.52 | 1.581 | 1.544 | 1.543 | 1.544 | 1.544 |
| 1.5384615384615385 | 1.578 | 1.545 | 1.543 | 1.544 | 1.544 |
| 1.5555555555555556 | 1.574 | 1.546 | 1.543 | 1.544 | 1.544 |
| 1.5714285714285714 | 1.571 | 1.547 | 1.543 | 1.544 | 1.544 |
| 1.5862068965517242 | 1.569 | 1.548 | 1.543 | 1.544 | 1.544 |
| 1.6 | 1.566 | 1.549 | 1.543 | 1.544 | 1.544 |
| 1.6129032258064515 | 1.564 | 1.55 | 1.543 | 1.544 | 1.544 |
| 1.625 | 1.561 | 1.551 | 1.542 | 1.544 | 1.544 |
| 1.6363636363636365 | 1.559 | 1.551 | 1.542 | 1.544 | 1.544 |
| 1.5 | 1.591 | 1.542 | 1.543 | 1.544 | 1.544 |
| 1.5185185185185186 | 1.587 | 1.544 | 1.543 | 1.544 | 1.544 |
| 1.5357142857142858 | 1.583 | 1.545 | 1.543 | 1.544 | 1.544 |
| 1.5517241379310345 | 1.58 | 1.546 | 1.543 | 1.544 | 1.544 |
| 1.5666666666666667 | 1.577 | 1.547 | 1.542 | 1.544 | 1.544 |
| 1.5806451612903225 | 1.574 | 1.548 | 1.542 | 1.544 | 1.544 |
| 1.59375 | 1.571 | 1.549 | 1.542 | 1.544 | 1.544 |
| 1.606060606060606 | 1.569 | 1.55 | 1.542 | 1.544 | 1.544 |
| 1.6176470588235294 | 1.567 | 1.55 | 1.542 | 1.544 | 1.544 |
| 1.6285714285714286 | 1.565 | 1.551 | 1.542 | 1.544 | 1.544 |
| 1.5 | 1.596 | 1.543 | 1.542 | 1.544 | 1.544 |
| 1.5172413793103448 | 1.592 | 1.544 | 1.542 | 1.544 | 1.544 |
| 1.5333333333333334 | 1.588 | 1.545 | 1.542 | 1.544 | 1.544 |
| 1.5483870967741935 | 1.585 | 1.546 | 1.542 | 1.544 | 1.544 |
| 1.5625 | 1.582 | 1.547 | 1.542 | 1.544 | 1.544 |
| 1.5757575757575757 | 1.579 | 1.548 | 1.542 | 1.544 | 1.544 |
| 1.588235294117647 | 1.576 | 1.549 | 1.542 | 1.544 | 1.544 |
| 1.6 | 1.574 | 1.549 | 1.542 | 1.544 | 1.544 |
| 1.6111111111111112 | 1.571 | 1.55 | 1.542 | 1.544 | 1.544 |
| 1.6216216216216217 | 1.569 | 1.551 | 1.542 | 1.544 | 1.544 |
| 1.5 | 1.5 | 1.538 | 1.545 | 1.544 | 1.544 |
| 1.5384615384615385 | 1.5 | 1.541 | 1.545 | 1.544 | 1.544 |
| 1.5714285714285714 | 1.5 | 1.543 | 1.545 | 1.544 | 1.544 |
| 1.6 | 1.5 | 1.545 | 1.545 | 1.544 | 1.544 |
| 1.625 | 1.5 | 1.547 | 1.544 | 1.544 | 1.544 |
| 1.6470588235294117 | 1.5 | 1.549 | 1.544 | 1.543 | 1.544 |
| 1.6666666666666667 | 1.5 | 1.55 | 1.544 | 1.543 | 1.544 |
| 1.6842105263157894 | 1.5 | 1.551 | 1.544 | 1.543 | 1.544 |
| 1.7 | 1.5 | 1.552 | 1.544 | 1.543 | 1.544 |
| 1.7142857142857142 | 1.5 | 1.553 | 1.544 | 1.543 | 1.544 |
| 1.5 | 1.519 | 1.539 | 1.545 | 1.544 | 1.544 |
| 1.5333333333333334 | 1.517 | 1.542 | 1.545 | 1.544 | 1.544 |
| 1.5625 | 1.516 | 1.544 | 1.544 | 1.544 | 1.544 |
| 1.588235294117647 | 1.515 | 1.545 | 1.544 | 1.544 | 1.544 |
| 1.6111111111111112 | 1.514 | 1.547 | 1.544 | 1.544 | 1.544 |
| 1.631578947368421 | 1.514 | 1.548 | 1.544 | 1.544 | 1.544 |
| 1.65 | 1.513 | 1.55 | 1.544 | 1.544 | 1.544 |
| 1.6666666666666667 | 1.512 | 1.551 | 1.544 | 1.544 | 1.544 |
| 1.6818181818181819 | 1.512 | 1.552 | 1.544 | 1.543 | 1.544 |
| 1.6956521739130435 | 1.511 | 1.553 | 1.544 | 1.543 | 1.544 |
| 1.5 | 1.533 | 1.54 | 1.544 | 1.544 | 1.544 |
| 1.5294117647058822 | 1.531 | 1.542 | 1.544 | 1.544 | 1.544 |
| 1.5555555555555556 | 1.529 | 1.544 | 1.544 | 1.544 | 1.544 |
| 1.5789473684210527 | 1.528 | 1.545 | 1.544 | 1.544 | 1.544 |
| 1.6 | 1.526 | 1.547 | 1.544 | 1.544 | 1.544 |
| 1.619047619047619 | 1.525 | 1.548 | 1.544 | 1.544 | 1.544 |
| 1.6363636363636365 | 1.524 | 1.549 | 1.544 | 1.544 | 1.544 |
| 1.6521739130434783 | 1.523 | 1.55 | 1.543 | 1.544 | 1.544 |
| 1.6666666666666667 | 1.522 | 1.551 | 1.543 | 1.544 | 1.544 |
| 1.68 | 1.521 | 1.552 | 1.543 | 1.544 | 1.544 |
| 1.5 | 1.545 | 1.541 | 1.544 | 1.544 | 1.544 |
| 1.5263157894736843 | 1.543 | 1.542 | 1.544 | 1.544 | 1.544 |
| 1.55 | 1.541 | 1.544 | 1.544 | 1.544 | 1.544 |
| 1.5714285714285714 | 1.538 | 1.545 | 1.544 | 1.544 | 1.544 |
| 1.5909090909090908 | 1.537 | 1.547 | 1.544 | 1.544 | 1.544 |
| 1.608695652173913 | 1.535 | 1.548 | 1.543 | 1.544 | 1.544 |
| 1.625 | 1.533 | 1.549 | 1.543 | 1.544 | 1.544 |
| 1.64 | 1.532 | 1.55 | 1.543 | 1.544 | 1.544 |
| 1.6538461538461537 | 1.531 | 1.551 | 1.543 | 1.544 | 1.544 |
| 1.6666666666666667 | 1.529 | 1.552 | 1.543 | 1.544 | 1.544 |
| 1.5 | 1.556 | 1.541 | 1.544 | 1.544 | 1.544 |
| 1.5238095238095237 | 1.553 | 1.543 | 1.544 | 1.544 | 1.544 |
| 1.5454545454545454 | 1.55 | 1.544 | 1.543 | 1.544 | 1.544 |
| 1.565217391304348 | 1.548 | 1.545 | 1.543 | 1.544 | 1.544 |
| 1.5833333333333333 | 1.545 | 1.547 | 1.543 | 1.544 | 1.544 |
| 1.6 | 1.543 | 1.548 | 1.543 | 1.544 | 1.544 |
| 1.6153846153846154 | 1.542 | 1.549 | 1.543 | 1.544 | 1.544 |
| 1.6296296296296295 | 1.54 | 1.55 | 1.543 | 1.544 | 1.544 |
| 1.6428571428571428 | 1.538 | 1.551 | 1.543 | 1.544 | 1.544 |
| 1.6551724137931034 | 1.537 | 1.551 | 1.543 | 1.544 | 1.544 |
| 1.5 | 1.564 | 1.541 | 1.543 | 1.544 | 1.544 |
| 1.5217391304347827 | 1.561 | 1.543 | 1.543 | 1.544 | 1.544 |
| 1.5416666666666667 | 1.558 | 1.544 | 1.543 | 1.544 | 1.544 |
| 1.56 | 1.556 | 1.545 | 1.543 | 1.544 | 1.544 |
| 1.5769230769230769 | 1.553 | 1.547 | 1.543 | 1.544 | 1.544 |
| 1.5925925925925926 | 1.551 | 1.548 | 1.543 | 1.544 | 1.544 |
| 1.6071428571428572 | 1.549 | 1.549 | 1.543 | 1.544 | 1.544 |
| 1.6206896551724137 | 1.547 | 1.549 | 1.543 | 1.544 | 1.544 |
| 1.6333333333333333 | 1.545 | 1.55 | 1.543 | 1.544 | 1.544 |
| 1.6451612903225807 | 1.544 | 1.551 | 1.543 | 1.544 | 1.544 |
| 1.5 | 1.571 | 1.542 | 1.543 | 1.544 | 1.544 |
| 1.52 | 1.568 | 1.543 | 1.543 | 1.544 | 1.544 |
| 1.5384615384615385 | 1.565 | 1.544 | 1.543 | 1.544 | 1.544 |
| 1.5555555555555556 | 1.562 | 1.545 | 1.543 | 1.544 | 1.544 |
| 1.5714285714285714 | 1.56 | 1.547 | 1.543 | 1.544 | 1.544 |
| 1.5862068965517242 | 1.558 | 1.547 | 1.543 | 1.544 | 1.544 |
| 1.6 | 1.556 | 1.548 | 1.543 | 1.544 | 1.544 |
| 1.6129032258064515 | 1.554 | 1.549 | 1.543 | 1.544 | 1.544 |
| 1.625 | 1.552 | 1.55 | 1.543 | 1.544 | 1.544 |
| 1.6363636363636365 | 1.55 | 1.551 | 1.543 | 1.544 | 1.544 |
| 1.5 | 1.578 | 1.542 | 1.543 | 1.544 | 1.544 |
| 1.5185185185185186 | 1.574 | 1.543 | 1.543 | 1.544 | 1.544 |
| 1.5357142857142858 | 1.571 | 1.544 | 1.543 | 1.544 | 1.544 |
| 1.5517241379310345 | 1.569 | 1.545 | 1.543 | 1.544 | 1.544 |
| 1.5666666666666667 | 1.566 | 1.546 | 1.543 | 1.544 | 1.544 |
| 1.5806451612903225 | 1.564 | 1.547 | 1.543 | 1.544 | 1.544 |
| 1.59375 | 1.561 | 1.548 | 1.543 | 1.544 | 1.544 |
| 1.606060606060606 | 1.559 | 1.549 | 1.543 | 1.544 | 1.544 |
| 1.6176470588235294 | 1.557 | 1.55 | 1.543 | 1.544 | 1.544 |
| 1.6285714285714286 | 1.556 | 1.55 | 1.543 | 1.544 | 1.544 |
| 1.5 | 1.583 | 1.542 | 1.543 | 1.544 | 1.544 |
| 1.5172413793103448 | 1.58 | 1.543 | 1.543 | 1.544 | 1.544 |
| 1.5333333333333334 | 1.577 | 1.544 | 1.543 | 1.544 | 1.544 |
| 1.5483870967741935 | 1.574 | 1.545 | 1.543 | 1.544 | 1.544 |
| 1.5625 | 1.571 | 1.546 | 1.543 | 1.544 | 1.544 |
| 1.5757575757575757 | 1.569 | 1.547 | 1.543 | 1.544 | 1.544 |
| 1.588235294117647 | 1.567 | 1.548 | 1.543 | 1.544 | 1.544 |
| 1.6 | 1.565 | 1.549 | 1.543 | 1.544 | 1.544 |
| 1.6111111111111112 | 1.562 | 1.55 | 1.543 | 1.544 | 1.544 |
| 1.6216216216216217 | 1.561 | 1.55 | 1.543 | 1.544 | 1.544 |
| 1.5 | 1.588 | 1.542 | 1.543 | 1.544 | 1.544 |
| 1.5161290322580645 | 1.585 | 1.543 | 1.543 | 1.544 | 1.544 |
| 1.53125 | 1.582 | 1.545 | 1.543 | 1.544 | 1.544 |
| 1.5454545454545454 | 1.579 | 1.545 | 1.543 | 1.544 | 1.544 |
| 1.5588235294117647 | 1.576 | 1.546 | 1.543 | 1.544 | 1.544 |
| 1.5714285714285714 | 1.574 | 1.547 | 1.543 | 1.544 | 1.544 |
| 1.5833333333333333 | 1.571 | 1.548 | 1.543 | 1.544 | 1.544 |
| 1.5945945945945945 | 1.569 | 1.549 | 1.542 | 1.544 | 1.544 |
| 1.605263157894737 | 1.567 | 1.549 | 1.542 | 1.544 | 1.544 |
| 1.6153846153846154 | 1.565 | 1.55 | 1.542 | 1.544 | 1.544 |
| 1.5 | 1.5 | 1.538 | 1.545 | 1.544 | 1.544 |
| 1.5333333333333334 | 1.5 | 1.541 | 1.545 | 1.544 | 1.544 |
| 1.5625 | 1.5 | 1.543 | 1.545 | 1.544 | 1.544 |
| 1.588235294117647 | 1.5 | 1.545 | 1.545 | 1.544 | 1.544 |
| 1.6111111111111112 | 1.5 | 1.546 | 1.545 | 1.544 | 1.544 |
| 1.631578947368421 | 1.5 | 1.548 | 1.544 | 1.544 | 1.544 |
| 1.65 | 1.5 | 1.549 | 1.544 | 1.543 | 1.544 |
| 1.6666666666666667 | 1.5 | 1.55 | 1.544 | 1.543 | 1.544 |
| 1.6818181818181819 | 1.5 | 1.551 | 1.544 | 1.543 | 1.544 |
| 1.6956521739130435 | 1.5 | 1.552 | 1.544 | 1.543 | 1.544 |
| 1.5 | 1.516 | 1.539 | 1.545 | 1.544 | 1.544 |
| 1.5294117647058822 | 1.515 | 1.541 | 1.545 | 1.544 | 1.544 |
| 1.5555555555555556 | 1.514 | 1.543 | 1.545 | 1.544 | 1.544 |
| 1.5789473684210527 | 1.514 | 1.545 | 1.544 | 1.544 | 1.544 |
| 1.6 | 1.513 | 1.546 | 1.544 | 1.544 | 1.544 |
| 1.619047619047619 | 1.512 | 1.547 | 1.544 | 1.544 | 1.544 |
| 1.6363636363636365 | 1.512 | 1.549 | 1.544 | 1.544 | 1.544 |
| 1.6521739130434783 | 1.511 | 1.55 | 1.544 | 1.544 | 1.544 |
| 1.6666666666666667 | 1.511 | 1.551 | 1.544 | 1.544 | 1.544 |
| 1.68 | 1.51 | 1.552 | 1.544 | 1.543 | 1.544 |
| 1.5 | 1.529 | 1.54 | 1.545 | 1.544 | 1.544 |
| 1.5263157894736843 | 1.528 | 1.542 | 1.544 | 1.544 | 1.544 |
| 1.55 | 1.526 | 1.543 | 1.544 | 1.544 | 1.544 |
| 1.5714285714285714 | 1.525 | 1.545 | 1.544 | 1.544 | 1.544 |
| 1.5909090909090908 | 1.524 | 1.546 | 1.544 | 1.544 | 1.544 |
| 1.608695652173913 | 1.523 | 1.547 | 1.544 | 1.544 | 1.544 |
| 1.625 | 1.522 | 1.548 | 1.544 | 1.544 | 1.544 |
| 1.64 | 1.521 | 1.549 | 1.544 | 1.544 | 1.544 |
| 1.6538461538461537 | 1.52 | 1.55 | 1.544 | 1.544 | 1.544 |
| 1.6666666666666667 | 1.519 | 1.551 | 1.543 | 1.544 | 1.544 |
| 1.5 | 1.541 | 1.54 | 1.544 | 1.544 | 1.544 |
| 1.5238095238095237 | 1.538 | 1.542 | 1.544 | 1.544 | 1.544 |
| 1.5454545454545454 | 1.537 | 1.543 | 1.544 | 1.544 | 1.544 |
| 1.565217391304348 | 1.535 | 1.545 | 1.544 | 1.544 | 1.544 |
| 1.5833333333333333 | 1.533 | 1.546 | 1.544 | 1.544 | 1.544 |
| 1.6 | 1.532 | 1.547 | 1.544 | 1.544 | 1.544 |
| 1.6153846153846154 | 1.531 | 1.548 | 1.544 | 1.544 | 1.544 |
| 1.6296296296296295 | 1.529 | 1.549 | 1.543 | 1.544 | 1.544 |
| 1.6428571428571428 | 1.528 | 1.55 | 1.543 | 1.544 | 1.544 |
| 1.6551724137931034 | 1.527 | 1.551 | 1.543 | 1.544 | 1.544 |
| 1.5 | 1.55 | 1.541 | 1.544 | 1.544 | 1.544 |
| 1.5217391304347827 | 1.548 | 1.542 | 1.544 | 1.544 | 1.544 |
| 1.5416666666666667 | 1.545 | 1.544 | 1.544 | 1.544 | 1.544 |
| 1.56 | 1.543 | 1.545 | 1.544 | 1.544 | 1.544 |
| 1.5769230769230769 | 1.542 | 1.546 | 1.543 | 1.544 | 1.544 |
| 1.5925925925925926 | 1.54 | 1.547 | 1.543 | 1.544 | 1.544 |
| 1.6071428571428572 | 1.538 | 1.548 | 1.543 | 1.544 | 1.544 |
| 1.6206896551724137 | 1.537 | 1.549 | 1.543 | 1.544 | 1.544 |
| 1.6333333333333333 | 1.536 | 1.55 | 1.543 | 1.544 | 1.544 |
| 1.6451612903225807 | 1.534 | 1.551 | 1.543 | 1.544 | 1.544 |
| 1.5 | 1.558 | 1.541 | 1.544 | 1.544 | 1.544 |
| 1.52 | 1.556 | 1.542 | 1.544 | 1.544 | 1.544 |
| 1.5384615384615385 | 1.553 | 1.544 | 1.543 | 1.544 | 1.544 |
| 1.5555555555555556 | 1.551 | 1.545 | 1.543 | 1.544 | 1.544 |
| 1.5714285714285714 | 1.549 | 1.546 | 1.543 | 1.544 | 1.544 |
| 1.5862068965517242 | 1.547 | 1.547 | 1.543 | 1.544 | 1.544 |
| 1.6 | 1.545 | 1.548 | 1.543 | 1.544 | 1.544 |
| 1.6129032258064515 | 1.544 | 1.549 | 1.543 | 1.544 | 1.544 |
| 1.625 | 1.542 | 1.55 | 1.543 | 1.544 | 1.544 |
| 1.6363636363636365 | 1.541 | 1.55 | 1.543 | 1.544 | 1.544 |
| 1.5 | 1.565 | 1.541 | 1.543 | 1.544 | 1.544 |
| 1.5185185185185186 | 1.562 | 1.543 | 1.543 | 1.544 | 1.544 |
| 1.5357142857142858 | 1.56 | 1.544 | 1.543 | 1.544 | 1.544 |
| 1.5517241379310345 | 1.558 | 1.545 | 1.543 | 1.544 | 1.544 |
| 1.5666666666666667 | 1.556 | 1.546 | 1.543 | 1.544 | 1.544 |
| 1.5806451612903225 | 1.554 | 1.547 | 1.543 | 1.544 | 1.544 |
| 1.59375 | 1.552 | 1.548 | 1.543 | 1.544 | 1.544 |
| 1.606060606060606 | 1.55 | 1.549 | 1.543 | 1.544 | 1.544 |
| 1.6176470588235294 | 1.548 | 1.549 | 1.543 | 1.544 | 1.544 |
| 1.6285714285714286 | 1.547 | 1.55 | 1.543 | 1.544 | 1.544 |
| 1.5 | 1.571 | 1.542 | 1.543 | 1.544 | 1.544 |
| 1.5172413793103448 | 1.569 | 1.543 | 1.543 | 1.544 | 1.544 |
| 1.5333333333333334 | 1.566 | 1.544 | 1.543 | 1.544 | 1.544 |
| 1.5483870967741935 | 1.564 | 1.545 | 1.543 | 1.544 | 1.544 |
| 1.5625 | 1.561 | 1.546 | 1.543 | 1.544 | 1.544 |
| 1.5757575757575757 | 1.559 | 1.547 | 1.543 | 1.544 | 1.544 |
| 1.588235294117647 | 1.557 | 1.548 | 1.543 | 1.544 | 1.544 |
| 1.6 | 1.556 | 1.548 | 1.543 | 1.544 | 1.544 |
| 1.6111111111111112 | 1.554 | 1.549 | 1.543 | 1.544 | 1.544 |
| 1.6216216216216217 | 1.552 | 1.55 | 1.543 | 1.544 | 1.544 |
| 1.5 | 1.577 | 1.542 | 1.543 | 1.544 | 1.544 |
| 1.5161290322580645 | 1.574 | 1.543 | 1.543 | 1.544 | 1.544 |
| 1.53125 | 1.571 | 1.544 | 1.543 | 1.544 | 1.544 |
| 1.5454545454545454 | 1.569 | 1.545 | 1.543 | 1.544 | 1.544 |
| 1.5588235294117647 | 1.567 | 1.546 | 1.543 | 1.544 | 1.544 |
| 1.5714285714285714 | 1.565 | 1.547 | 1.543 | 1.544 | 1.544 |
| 1.5833333333333333 | 1.562 | 1.548 | 1.543 | 1.544 | 1.544 |
| 1.5945945945945945 | 1.561 | 1.548 | 1.543 | 1.544 | 1.544 |
| 1.605263157894737 | 1.559 | 1.549 | 1.543 | 1.544 | 1.544 |
| 1.6153846153846154 | 1.557 | 1.55 | 1.543 | 1.544 | 1.544 |
| 1.5 | 1.582 | 1.542 | 1.543 | 1.544 | 1.544 |
| 1.5151515151515151 | 1.579 | 1.543 | 1.543 | 1.544 | 1.544 |
| 1.5294117647058822 | 1.576 | 1.544 | 1.543 | 1.544 | 1.544 |
| 1.542857142857143 | 1.574 | 1.545 | 1.543 | 1.544 | 1.544 |
| 1.5555555555555556 | 1.571 | 1.546 | 1.543 | 1.544 | 1.544 |
| 1.5675675675675675 | 1.569 | 1.547 | 1.543 | 1.544 | 1.544 |
| 1.5789473684210527 | 1.567 | 1.547 | 1.543 | 1.544 | 1.544 |
| 1.5897435897435896 | 1.565 | 1.548 | 1.543 | 1.544 | 1.544 |
| 1.6 | 1.563 | 1.549 | 1.543 | 1.544 | 1.544 |
| 1.6097560975609757 | 1.562 | 1.549 | 1.543 | 1.544 | 1.544 |
| 1.5 | 1.5 | 1.538 | 1.545 | 1.544 | 1.544 |
| 1.5294117647058822 | 1.5 | 1.541 | 1.545 | 1.544 | 1.544 |
| 1.5555555555555556 | 1.5 | 1.542 | 1.545 | 1.544 | 1.544 |
| 1.5789473684210527 | 1.5 | 1.544 | 1.545 | 1.544 | 1.544 |
| 1.6 | 1.5 | 1.545 | 1.545 | 1.544 | 1.544 |
| 1.619047619047619 | 1.5 | 1.547 | 1.544 | 1.544 | 1.544 |
| 1.6363636363636365 | 1.5 | 1.548 | 1.544 | 1.544 | 1.544 |
| 1.6521739130434783 | 1.5 | 1.549 | 1.544 | 1.543 | 1.544 |
| 1.6666666666666667 | 1.5 | 1.55 | 1.544 | 1.543 | 1.544 |
| 1.68 | 1.5 | 1.551 | 1.544 | 1.543 | 1.544 |
| 1.5 | 1.514 | 1.539 | 1.545 | 1.544 | 1.544 |
| 1.5263157894736843 | 1.514 | 1.541 | 1.545 | 1.544 | 1.544 |
| 1.55 | 1.513 | 1.543 | 1.545 | 1.544 | 1.544 |
| 1.5714285714285714 | 1.512 | 1.544 | 1.544 | 1.544 | 1.544 |
| 1.5909090909090908 | 1.512 | 1.545 | 1.544 | 1.544 | 1.544 |
| 1.608695652173913 | 1.511 | 1.547 | 1.544 | 1.544 | 1.544 |
| 1.625 | 1.511 | 1.548 | 1.544 | 1.544 | 1.544 |
| 1.64 | 1.51 | 1.549 | 1.544 | 1.544 | 1.544 |
| 1.6538461538461537 | 1.51 | 1.55 | 1.544 | 1.544 | 1.544 |
| 1.6666666666666667 | 1.509 | 1.551 | 1.544 | 1.543 | 1.544 |
| 1.5 | 1.526 | 1.54 | 1.545 | 1.544 | 1.544 |
| 1.5238095238095237 | 1.525 | 1.541 | 1.544 | 1.544 | 1.544 |
| 1.5454545454545454 | 1.524 | 1.543 | 1.544 | 1.544 | 1.544 |
| 1.565217391304348 | 1.523 | 1.544 | 1.544 | 1.544 | 1.544 |
| 1.5833333333333333 | 1.522 | 1.545 | 1.544 | 1.544 | 1.544 |
| 1.6 | 1.521 | 1.547 | 1.544 | 1.544 | 1.544 |
| 1.6153846153846154 | 1.52 | 1.548 | 1.544 | 1.544 | 1.544 |
| 1.6296296296296295 | 1.519 | 1.549 | 1.544 | 1.544 | 1.544 |
| 1.6428571428571428 | 1.519 | 1.549 | 1.544 | 1.544 | 1.544 |
| 1.6551724137931034 | 1.518 | 1.55 | 1.544 | 1.544 | 1.544 |
| 1.5 | 1.537 | 1.54 | 1.544 | 1.544 | 1.544 |
| 1.5217391304347827 | 1.535 | 1.542 | 1.544 | 1.544 | 1.544 |
| 1.5416666666666667 | 1.533 | 1.543 | 1.544 | 1.544 | 1.544 |
| 1.56 | 1.532 | 1.544 | 1.544 | 1.544 | 1.544 |
| 1.5769230769230769 | 1.531 | 1.545 | 1.544 | 1.544 | 1.544 |
| 1.5925925925925926 | 1.529 | 1.547 | 1.544 | 1.544 | 1.544 |
| 1.6071428571428572 | 1.528 | 1.547 | 1.544 | 1.544 | 1.544 |
| 1.6206896551724137 | 1.527 | 1.548 | 1.544 | 1.544 | 1.544 |
| 1.6333333333333333 | 1.526 | 1.549 | 1.544 | 1.544 | 1.544 |
| 1.6451612903225807 | 1.525 | 1.55 | 1.543 | 1.544 | 1.544 |
| 1.5 | 1.545 | 1.541 | 1.544 | 1.544 | 1.544 |
| 1.52 | 1.543 | 1.542 | 1.544 | 1.544 | 1.544 |
| 1.5384615384615385 | 1.542 | 1.543 | 1.544 | 1.544 | 1.544 |
| 1.5555555555555556 | 1.54 | 1.544 | 1.544 | 1.544 | 1.544 |
| 1.5714285714285714 | 1.538 | 1.545 | 1.544 | 1.544 | 1.544 |
| 1.5862068965517242 | 1.537 | 1.546 | 1.544 | 1.544 | 1.544 |
| 1.6 | 1.536 | 1.547 | 1.543 | 1.544 | 1.544 |
| 1.6129032258064515 | 1.534 | 1.548 | 1.543 | 1.544 | 1.544 |
| 1.625 | 1.533 | 1.549 | 1.543 | 1.544 | 1.544 |
| 1.6363636363636365 | 1.532 | 1.55 | 1.543 | 1.544 | 1.544 |
| 1.5 | 1.553 | 1.541 | 1.544 | 1.544 | 1.544 |
| 1.5185185185185186 | 1.551 | 1.542 | 1.544 | 1.544 | 1.544 |
| 1.5357142857142858 | 1.549 | 1.543 | 1.544 | 1.544 | 1.544 |
| 1.5517241379310345 | 1.547 | 1.544 | 1.544 | 1.544 | 1.544 |
| 1.5666666666666667 | 1.545 | 1.545 | 1.543 | 1.544 | 1.544 |
| 1.5806451612903225 | 1.544 | 1.546 | 1.543 | 1.544 | 1.544 |
| 1.59375 | 1.542 | 1.547 | 1.543 | 1.544 | 1.544 |
| 1.606060606060606 | 1.541 | 1.548 | 1.543 | 1.544 | 1.544 |
| 1.6176470588235294 | 1.54 | 1.549 | 1.543 | 1.544 | 1.544 |
| 1.6285714285714286 | 1.538 | 1.55 | 1.543 | 1.544 | 1.544 |
| 1.5 | 1.56 | 1.541 | 1.544 | 1.544 | 1.544 |
| 1.5172413793103448 | 1.558 | 1.542 | 1.543 | 1.544 | 1.544 |
| 1.5333333333333334 | 1.556 | 1.543 | 1.543 | 1.544 | 1.544 |
| 1.5483870967741935 | 1.554 | 1.545 | 1.543 | 1.544 | 1.544 |
| 1.5625 | 1.552 | 1.545 | 1.543 | 1.544 | 1.544 |
| 1.5757575757575757 | 1.55 | 1.546 | 1.543 | 1.544 | 1.544 |
| 1.588235294117647 | 1.548 | 1.547 | 1.543 | 1.544 | 1.544 |
| 1.6 | 1.547 | 1.548 | 1.543 | 1.544 | 1.544 |
| 1.6111111111111112 | 1.545 | 1.549 | 1.543 | 1.544 | 1.544 |
| 1.6216216216216217 | 1.544 | 1.549 | 1.543 | 1.544 | 1.544 |
| 1.5 | 1.566 | 1.541 | 1.543 | 1.544 | 1.544 |
| 1.5161290322580645 | 1.564 | 1.543 | 1.543 | 1.544 | 1.544 |
| 1.53125 | 1.561 | 1.544 | 1.543 | 1.544 | 1.544 |
| 1.5454545454545454 | 1.559 | 1.545 | 1.543 | 1.544 | 1.544 |
| 1.5588235294117647 | 1.557 | 1.545 | 1.543 | 1.544 | 1.544 |
| 1.5714285714285714 | 1.556 | 1.546 | 1.543 | 1.544 | 1.544 |
| 1.5833333333333333 | 1.554 | 1.547 | 1.543 | 1.544 | 1.544 |
| 1.5945945945945945 | 1.552 | 1.548 | 1.543 | 1.544 | 1.544 |
| 1.605263157894737 | 1.551 | 1.549 | 1.543 | 1.544 | 1.544 |
| 1.6153846153846154 | 1.549 | 1.549 | 1.543 | 1.544 | 1.544 |
| 1.5 | 1.571 | 1.542 | 1.543 | 1.544 | 1.544 |
| 1.5151515151515151 | 1.569 | 1.543 | 1.543 | 1.544 | 1.544 |
| 1.5294117647058822 | 1.567 | 1.544 | 1.543 | 1.544 | 1.544 |
| 1.542857142857143 | 1.565 | 1.545 | 1.543 | 1.544 | 1.544 |
| 1.5555555555555556 | 1.562 | 1.545 | 1.543 | 1.544 | 1.544 |
| 1.5675675675675675 | 1.561 | 1.546 | 1.543 | 1.544 | 1.544 |
| 1.5789473684210527 | 1.559 | 1.547 | 1.543 | 1.544 | 1.544 |
| 1.5897435897435896 | 1.557 | 1.548 | 1.543 | 1.544 | 1.544 |
| 1.6 | 1.556 | 1.548 | 1.543 | 1.544 | 1.544 |
| 1.6097560975609757 | 1.554 | 1.549 | 1.543 | 1.544 | 1.544 |
| 1.5 | 1.576 | 1.542 | 1.543 | 1.544 | 1.544 |
| 1.5142857142857142 | 1.574 | 1.543 | 1.543 | 1.544 | 1.544 |
| 1.5277777777777777 | 1.571 | 1.544 | 1.543 | 1.544 | 1.544 |
| 1.5405405405405406 | 1.569 | 1.545 | 1.543 | 1.544 | 1.544 |
| 1.5526315789473684 | 1.567 | 1.545 | 1.543 | 1.544 | 1.544 |
| 1.564102564102564 | 1.565 | 1.546 | 1.543 | 1.544 | 1.544 |
| 1.575 | 1.563 | 1.547 | 1.543 | 1.544 | 1.544 |
| 1.5853658536585367 | 1.562 | 1.548 | 1.543 | 1.544 | 1.544 |
| 1.5952380952380953 | 1.56 | 1.548 | 1.543 | 1.544 | 1.544 |
| 1.6046511627906976 | 1.558 | 1.549 | 1.543 | 1.544 | 1.544 |
| 1.5 | 1.5 | 1.538 | 1.545 | 1.544 | 1.544 |
| 1.5263157894736843 | 1.5 | 1.54 | 1.545 | 1.544 | 1.544 |
| 1.55 | 1.5 | 1.542 | 1.545 | 1.544 | 1.544 |
| 1.5714285714285714 | 1.5 | 1.543 | 1.545 | 1.544 | 1.544 |
| 1.5909090909090908 | 1.5 | 1.545 | 1.545 | 1.544 | 1.544 |
| 1.608695652173913 | 1.5 | 1.546 | 1.545 | 1.544 | 1.544 |
| 1.625 | 1.5 | 1.547 | 1.544 | 1.544 | 1.544 |
| 1.64 | 1.5 | 1.548 | 1.544 | 1.544 | 1.544 |
| 1.6538461538461537 | 1.5 | 1.549 | 1.544 | 1.543 | 1.544 |
| 1.6666666666666667 | 1.5 | 1.55 | 1.544 | 1.543 | 1.544 |
| 1.5 | 1.513 | 1.539 | 1.545 | 1.544 | 1.544 |
| 1.5238095238095237 | 1.512 | 1.541 | 1.545 | 1.544 | 1.544 |
| 1.5454545454545454 | 1.512 | 1.542 | 1.545 | 1.544 | 1.544 |
| 1.565217391304348 | 1.511 | 1.544 | 1.545 | 1.544 | 1.544 |
| 1.5833333333333333 | 1.511 | 1.545 | 1.544 | 1.544 | 1.544 |
| 1.6 | 1.51 | 1.546 | 1.544 | 1.544 | 1.544 |
| 1.6153846153846154 | 1.51 | 1.547 | 1.544 | 1.544 | 1.544 |
| 1.6296296296296295 | 1.509 | 1.548 | 1.544 | 1.544 | 1.544 |
| 1.6428571428571428 | 1.509 | 1.549 | 1.544 | 1.544 | 1.544 |
| 1.6551724137931034 | 1.509 | 1.55 | 1.544 | 1.544 | 1.544 |
| 1.5 | 1.524 | 1.54 | 1.545 | 1.544 | 1.544 |
| 1.5217391304347827 | 1.523 | 1.541 | 1.545 | 1.544 | 1.544 |
| 1.5416666666666667 | 1.522 | 1.542 | 1.544 | 1.544 | 1.544 |
| 1.56 | 1.521 | 1.544 | 1.544 | 1.544 | 1.544 |
| 1.5769230769230769 | 1.52 | 1.545 | 1.544 | 1.544 | 1.544 |
| 1.5925925925925926 | 1.519 | 1.546 | 1.544 | 1.544 | 1.544 |
| 1.6071428571428572 | 1.519 | 1.547 | 1.544 | 1.544 | 1.544 |
| 1.6206896551724137 | 1.518 | 1.548 | 1.544 | 1.544 | 1.544 |
| 1.6333333333333333 | 1.517 | 1.549 | 1.544 | 1.544 | 1.544 |
| 1.6451612903225807 | 1.517 | 1.55 | 1.544 | 1.544 | 1.544 |
| 1.5 | 1.533 | 1.54 | 1.544 | 1.544 | 1.544 |
| 1.52 | 1.532 | 1.541 | 1.544 | 1.544 | 1.544 |
| 1.5384615384615385 | 1.531 | 1.543 | 1.544 | 1.544 | 1.544 |
| 1.5555555555555556 | 1.529 | 1.544 | 1.544 | 1.544 | 1.544 |
| 1.5714285714285714 | 1.528 | 1.545 | 1.544 | 1.544 | 1.544 |
| 1.5862068965517242 | 1.527 | 1.546 | 1.544 | 1.544 | 1.544 |
| 1.6 | 1.526 | 1.547 | 1.544 | 1.544 | 1.544 |
| 1.6129032258064515 | 1.525 | 1.548 | 1.544 | 1.544 | 1.544 |
| 1.625 | 1.525 | 1.549 | 1.544 | 1.544 | 1.544 |
| 1.6363636363636365 | 1.524 | 1.549 | 1.544 | 1.544 | 1.544 |
| 1.5 | 1.542 | 1.54 | 1.544 | 1.544 | 1.544 |
| 1.5185185185185186 | 1.54 | 1.542 | 1.544 | 1.544 | 1.544 |
| 1.5357142857142858 | 1.538 | 1.543 | 1.544 | 1.544 | 1.544 |
| 1.5517241379310345 | 1.537 | 1.544 | 1.544 | 1.544 | 1.544 |
| 1.5666666666666667 | 1.536 | 1.545 | 1.544 | 1.544 | 1.544 |
| 1.5806451612903225 | 1.534 | 1.546 | 1.544 | 1.544 | 1.544 |
| 1.59375 | 1.533 | 1.547 | 1.544 | 1.544 | 1.544 |
| 1.606060606060606 | 1.532 | 1.548 | 1.544 | 1.544 | 1.544 |
| 1.6176470588235294 | 1.531 | 1.548 | 1.543 | 1.544 | 1.544 |
| 1.6285714285714286 | 1.53 | 1.549 | 1.543 | 1.544 | 1.544 |
| 1.5 | 1.549 | 1.541 | 1.544 | 1.544 | 1.544 |
| 1.5172413793103448 | 1.547 | 1.542 | 1.544 | 1.544 | 1.544 |
| 1.5333333333333334 | 1.545 | 1.543 | 1.544 | 1.544 | 1.544 |
| 1.5483870967741935 | 1.544 | 1.544 | 1.544 | 1.544 | 1.544 |
| 1.5625 | 1.542 | 1.545 | 1.544 | 1.544 | 1.544 |
| 1.5757575757575757 | 1.541 | 1.546 | 1.544 | 1.544 | 1.544 |
| 1.588235294117647 | 1.54 | 1.547 | 1.543 | 1.544 | 1.544 |
| 1.6 | 1.538 | 1.548 | 1.543 | 1.544 | 1.544 |
| 1.6111111111111112 | 1.537 | 1.548 | 1.543 | 1.544 | 1.544 |
| 1.6216216216216217 | 1.536 | 1.549 | 1.543 | 1.544 | 1.544 |
| 1.5 | 1.556 | 1.541 | 1.544 | 1.544 | 1.544 |
| 1.5161290322580645 | 1.554 | 1.542 | 1.544 | 1.544 | 1.544 |
| 1.53125 | 1.552 | 1.543 | 1.544 | 1.544 | 1.544 |
| 1.5454545454545454 | 1.55 | 1.544 | 1.543 | 1.544 | 1.544 |
| 1.5588235294117647 | 1.548 | 1.545 | 1.543 | 1.544 | 1.544 |
| 1.5714285714285714 | 1.547 | 1.546 | 1.543 | 1.544 | 1.544 |
| 1.5833333333333333 | 1.545 | 1.547 | 1.543 | 1.544 | 1.544 |
| 1.5945945945945945 | 1.544 | 1.547 | 1.543 | 1.544 | 1.544 |
| 1.605263157894737 | 1.543 | 1.548 | 1.543 | 1.544 | 1.544 |
| 1.6153846153846154 | 1.542 | 1.549 | 1.543 | 1.544 | 1.544 |
| 1.5 | 1.561 | 1.541 | 1.544 | 1.544 | 1.544 |
| 1.5151515151515151 | 1.559 | 1.542 | 1.543 | 1.544 | 1.544 |
| 1.5294117647058822 | 1.557 | 1.543 | 1.543 | 1.544 | 1.544 |
| 1.542857142857143 | 1.556 | 1.544 | 1.543 | 1.544 | 1.544 |
| 1.5555555555555556 | 1.554 | 1.545 | 1.543 | 1.544 | 1.544 |
| 1.5675675675675675 | 1.552 | 1.546 | 1.543 | 1.544 | 1.544 |
| 1.5789473684210527 | 1.551 | 1.547 | 1.543 | 1.544 | 1.544 |
| 1.5897435897435896 | 1.549 | 1.547 | 1.543 | 1.544 | 1.544 |
| 1.6 | 1.548 | 1.548 | 1.543 | 1.544 | 1.544 |
| 1.6097560975609757 | 1.547 | 1.549 | 1.543 | 1.544 | 1.544 |
| 1.5 | 1.567 | 1.541 | 1.543 | 1.544 | 1.544 |
| 1.5142857142857142 | 1.565 | 1.542 | 1.543 | 1.544 | 1.544 |
| 1.5277777777777777 | 1.562 | 1.543 | 1.543 | 1.544 | 1.544 |
| 1.5405405405405406 | 1.561 | 1.544 | 1.543 | 1.544 | 1.544 |
| 1.5526315789473684 | 1.559 | 1.545 | 1.543 | 1.544 | 1.544 |
| 1.564102564102564 | 1.557 | 1.546 | 1.543 | 1.544 | 1.544 |
| 1.575 | 1.556 | 1.547 | 1.543 | 1.544 | 1.544 |
| 1.5853658536585367 | 1.554 | 1.547 | 1.543 | 1.544 | 1.544 |
| 1.5952380952380953 | 1.553 | 1.548 | 1.543 | 1.544 | 1.544 |
| 1.6046511627906976 | 1.551 | 1.549 | 1.543 | 1.544 | 1.544 |
| 1.5 | 1.571 | 1.542 | 1.543 | 1.544 | 1.544 |
| 1.5135135135135136 | 1.569 | 1.543 | 1.543 | 1.544 | 1.544 |
| 1.5263157894736843 | 1.567 | 1.543 | 1.543 | 1.544 | 1.544 |
| 1.5384615384615385 | 1.565 | 1.544 | 1.543 | 1.544 | 1.544 |
| 1.55 | 1.563 | 1.545 | 1.543 | 1.544 | 1.544 |
| 1.5609756097560976 | 1.562 | 1.546 | 1.543 | 1.544 | 1.544 |
| 1.5714285714285714 | 1.56 | 1.547 | 1.543 | 1.544 | 1.544 |
| 1.5813953488372092 | 1.558 | 1.547 | 1.543 | 1.544 | 1.544 |
| 1.5909090909090908 | 1.557 | 1.548 | 1.543 | 1.544 | 1.544 |
| 1.6 | 1.556 | 1.548 | 1.543 | 1.544 | 1.544 |